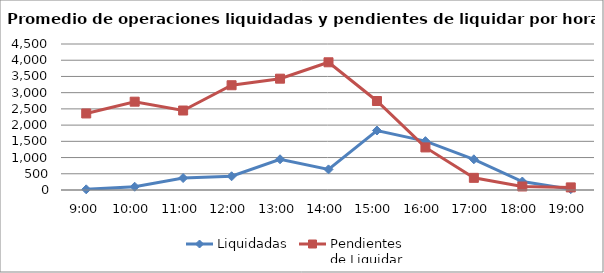
| Category | Liquidadas | Pendientes
de Liquidar |
|---|---|---|
| 0.375 | 20.35 | 2359.2 |
| 0.4166666666666667 | 101.1 | 2722.4 |
| 0.4583333333333333 | 368.5 | 2449.55 |
| 0.5 | 423.05 | 3228.95 |
| 0.5416666666666666 | 946.85 | 3431.25 |
| 0.583333333333333 | 634.9 | 3936.25 |
| 0.625 | 1833.5 | 2743.1 |
| 0.666666666666667 | 1505.75 | 1312.3 |
| 0.708333333333333 | 946.05 | 375 |
| 0.75 | 261.95 | 108.5 |
| 0.791666666666667 | 26.2 | 80.3 |